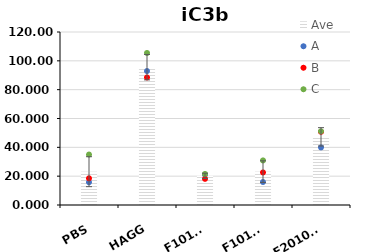
| Category | Ave |
|---|---|
| PBS | 23.112 |
| HAGG | 95.614 |
| F10102 | 20.218 |
| F10103 | 23.141 |
| F20104A | 47.279 |